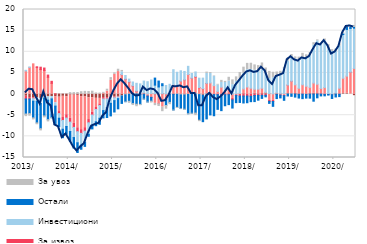
| Category | По трансакционим рачунима | За ликвидност и обртна средства  | За извоз | Инвестициони | Остали | За увоз |
|---|---|---|---|---|---|---|
| 2013-01-01 | -0.509 | 5.466 | -0.655 | 0.157 | -3.557 | -0.62 |
| 2013-02-01 | -0.821 | 6.307 | -0.351 | 0.101 | -3.442 | -0.636 |
| 2013-03-01 | -0.908 | 7.144 | -0.174 | -0.604 | -3.955 | -0.473 |
| 2013-04-01 | -0.906 | 6.265 | 0.188 | -0.805 | -5.11 | -0.441 |
| 2013-05-01 | -1.028 | 5.791 | 0.566 | -1.205 | -5.942 | -0.539 |
| 2013-06-01 | -0.715 | 5.566 | 0.59 | -0.246 | -4.209 | -0.467 |
| 2013-07-01 | -0.656 | 3.962 | 0.527 | -0.788 | -4.619 | -0.522 |
| 2013-08-01 | -0.571 | 2.543 | 0.475 | -0.574 | -4.455 | -0.211 |
| 2013-09-01 | -0.597 | -1.463 | 0.046 | -0.788 | -4.325 | -0.17 |
| 2013-10-01 | -0.731 | -3.405 | -0.479 | -1.101 | -1.998 | -0.034 |
| 2013-11-01 | -0.534 | -5.012 | -0.697 | -2.071 | -1.999 | 0.032 |
| 2013-12-01 | -0.631 | -4.25 | -0.793 | -2 | -1.812 | 0.042 |
| 2014-01-01 | -0.248 | -5.468 | -0.921 | -2.223 | -2.314 | 0.338 |
| 2014-02-01 | -0.244 | -6.677 | -0.967 | -2.397 | -2.478 | 0.345 |
| 2014-03-01 | -0.312 | -7.664 | -0.914 | -2.634 | -2.299 | 0.368 |
| 2014-04-01 | -0.598 | -7.82 | -0.878 | -2.779 | -0.977 | 0.561 |
| 2014-05-01 | -0.678 | -7.271 | -0.835 | -2.63 | -0.953 | 0.634 |
| 2014-06-01 | -0.89 | -5.133 | -0.763 | -2.735 | -0.458 | 0.61 |
| 2014-07-01 | -0.861 | -3.427 | -0.672 | -2.518 | -0.758 | 0.681 |
| 2014-08-01 | -1.004 | -2.174 | -0.467 | -2.918 | -0.917 | 0.276 |
| 2014-09-01 | -1.021 | -1.308 | -0.375 | -3.018 | -1.426 | 0.243 |
| 2014-10-01 | -0.819 | 0.161 | -0.34 | -2.752 | -1.718 | 0.247 |
| 2014-11-01 | -0.858 | 0.695 | -0.279 | -2.093 | -2.317 | 0.459 |
| 2014-12-01 | -0.577 | 3.263 | -0.264 | -1.35 | -2.967 | 0.625 |
| 2015-01-01 | -0.712 | 4.673 | -0.142 | -0.704 | -2.68 | 0.34 |
| 2015-02-01 | -0.565 | 5.321 | -0.111 | -0.407 | -2.409 | 0.553 |
| 2015-03-01 | -0.434 | 4.59 | 0.008 | 0.669 | -1.773 | 0.324 |
| 2015-04-01 | -0.175 | 3.498 | 0.044 | 0.845 | -1.638 | -0.132 |
| 2015-05-01 | -0.054 | 2.82 | 0.068 | 0.654 | -1.651 | -0.488 |
| 2015-06-01 | 0.05 | 1.84 | 0.063 | 0.904 | -2.258 | -0.459 |
| 2015-07-01 | 0.129 | 0.502 | 0.07 | 1.849 | -2.403 | -0.592 |
| 2015-08-01 | 0.104 | 0.009 | -0.067 | 2.291 | -2.376 | -0.307 |
| 2015-09-01 | 0.112 | 0.208 | -0.055 | 2.751 | -1.148 | -0.214 |
| 2015-10-01 | 0.038 | -0.411 | -0.06 | 2.883 | -1.421 | -0.215 |
| 2015-11-01 | 0.131 | -0.703 | -0.076 | 3.2 | -0.895 | -0.44 |
| 2015-12-01 | 0.06 | -2.198 | 0.008 | 2.045 | 1.664 | -0.542 |
| 2016-01-01 | 0.112 | -2.269 | -0.03 | 1.566 | 1.404 | -0.65 |
| 2016-02-01 | 0.086 | -3.097 | 0.005 | 1.894 | 0.462 | -1.069 |
| 2016-03-01 | 0.054 | -1.187 | -0.022 | 1.97 | -1.494 | -0.878 |
| 2016-04-01 | 0.002 | 0.259 | -0.024 | 2.055 | -1.952 | -0.542 |
| 2016-05-01 | -0.049 | 2.232 | -0.014 | 3.525 | -3.719 | -0.201 |
| 2016-06-01 | -0.049 | 2.038 | 0.004 | 3.11 | -3.101 | -0.262 |
| 2016-07-01 | -0.188 | 3.046 | 0.004 | 2.456 | -3.237 | -0.159 |
| 2016-08-01 | -0.222 | 3.353 | 0.003 | 1.994 | -3.361 | -0.259 |
| 2016-09-01 | -0.107 | 4.637 | 0.003 | 1.923 | -4.549 | -0.209 |
| 2016-10-01 | -0.069 | 3.752 | 0.02 | 1.099 | -4.471 | -0.197 |
| 2016-11-01 | 0.003 | 4.032 | 0.118 | 1.076 | -4.499 | -0.6 |
| 2016-12-01 | -0.126 | 1.493 | 0.07 | 2.199 | -6.059 | -0.332 |
| 2017-01-01 | -0.287 | 1.255 | 0.034 | 2.468 | -6.239 | 0.016 |
| 2017-02-01 | -0.028 | 2.502 | 0.033 | 2.337 | -5.845 | 0.328 |
| 2017-03-01 | -0.212 | 2.639 | -0.061 | 2.218 | -4.66 | 0.242 |
| 2017-04-01 | 0.006 | 1.986 | -0.118 | 2.178 | -5.005 | 0.123 |
| 2017-05-01 | -0.021 | 0.622 | -0.131 | 1.488 | -3.457 | 0.202 |
| 2017-06-01 | -0.058 | 1.637 | -0.146 | 1.1 | -3.715 | 0.504 |
| 2017-07-01 | 0.066 | 0.742 | -0.146 | 1.936 | -2.615 | 0.257 |
| 2017-08-01 | 0.095 | 1.091 | -0.147 | 1.891 | -2.348 | 0.891 |
| 2017-09-01 | -0.033 | -1.003 | -0.338 | 2.229 | -1.931 | 1.128 |
| 2017-10-01 | 0.035 | -0.002 | -0.349 | 2.95 | -1.675 | 1.076 |
| 2017-11-01 | -0.038 | 0.191 | -0.423 | 3.298 | -1.519 | 1.614 |
| 2017-12-01 | 0.111 | 1.115 | -0.472 | 3.68 | -1.636 | 1.452 |
| 2018-01-01 | -0.017 | 1.678 | -0.449 | 4.093 | -1.582 | 1.485 |
| 2018-02-01 | -0.076 | 1.395 | -0.446 | 4.432 | -1.275 | 1.464 |
| 2018-03-01 | 0.181 | 0.968 | -0.353 | 4.465 | -1.426 | 1.286 |
| 2018-04-01 | 0.071 | 1.103 | -0.297 | 4.181 | -1.141 | 1.381 |
| 2018-05-01 | 0.137 | 1.251 | -0.296 | 4.4 | -0.726 | 1.574 |
| 2018-06-01 | 0.284 | 0.134 | -0.277 | 4.559 | -0.377 | 1.191 |
| 2018-07-01 | 0.145 | -1.444 | -0.282 | 3.523 | -0.476 | 1.691 |
| 2018-08-01 | 0.047 | -1.482 | -0.277 | 3.826 | -1.138 | 1.281 |
| 2018-09-01 | 0.187 | 0.07 | -0.088 | 3.999 | -0.981 | 0.962 |
| 2018-10-01 | 0.165 | -0.154 | -0.086 | 4.312 | -0.67 | 0.902 |
| 2018-11-01 | 0.151 | -0.294 | -0.083 | 5.778 | -1.1 | 0.383 |
| 2018-12-01 | 0.121 | 2.002 | 0.005 | 5.72 | -0.449 | 0.69 |
| 2019-01-01 | 0.084 | 2.964 | 0.003 | 5.799 | -0.532 | 0.511 |
| 2019-02-01 | 0.122 | 2.071 | -0.001 | 6.112 | -0.71 | 0.483 |
| 2019-03-01 | -0.043 | 1.384 | -0.007 | 6.432 | -0.89 | 0.926 |
| 2019-04-01 | -0.017 | 2.209 | -0.007 | 6.458 | -1.061 | 0.975 |
| 2019-05-01 | -0.065 | 1.864 | -0.007 | 6.82 | -0.881 | 0.597 |
| 2019-06-01 | 0.071 | 1.52 | -0.011 | 7.649 | -0.954 | 0.599 |
| 2019-07-01 | 0.174 | 2.439 | -0.011 | 8.965 | -1.672 | 0.577 |
| 2019-08-01 | 0.114 | 2.222 | -0.011 | 10.233 | -0.877 | 0.238 |
| 2019-09-01 | 0.013 | 1.329 | -0.011 | 10.479 | -0.423 | 0.206 |
| 2019-10-31 | -0.066 | 1.541 | -0.01 | 11.047 | -0.342 | 0.436 |
| 2019-11-30 | -0.091 | 0.084 | -0.01 | 10.759 | -0.137 | 0.843 |
| 2019-12-31 | -0.112 | -0.022 | -0.01 | 10.098 | -0.896 | 0.408 |
| 2020-01-31 | 0.054 | 0.141 | -0.01 | 9.923 | -0.677 | 0.532 |
| 2020-02-29 | -0.038 | 1.384 | -0.005 | 9.987 | -0.557 | 0.483 |
| 2020-03-31 | 0.142 | 3.609 | 0 | 10.341 | 0.142 | 0.224 |
| 2020-04-30 | 0.16 | 4.087 | 0 | 11.041 | 0.559 | 0.149 |
| 2020-05-31 | -0.034 | 5.187 | 0.005 | 10.338 | 0.308 | 0.306 |
| 2020-06-30 | -0.38 | 6.042 | 0.022 | 9.534 | 0.223 | 0.414 |